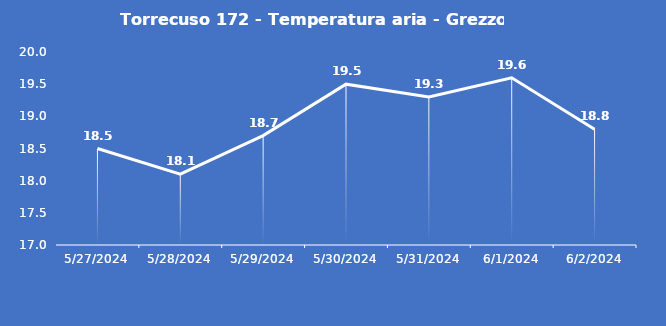
| Category | Torrecuso 172 - Temperatura aria - Grezzo (°C) |
|---|---|
| 5/27/24 | 18.5 |
| 5/28/24 | 18.1 |
| 5/29/24 | 18.7 |
| 5/30/24 | 19.5 |
| 5/31/24 | 19.3 |
| 6/1/24 | 19.6 |
| 6/2/24 | 18.8 |